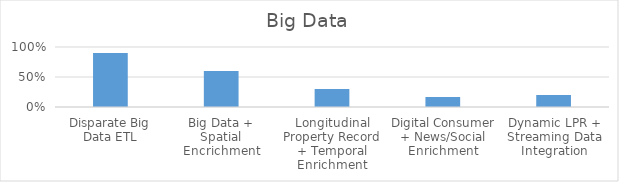
| Category | Series 0 |
|---|---|
| Disparate Big Data ETL | 0.9 |
| Big Data + Spatial Encrichment | 0.6 |
| Longitudinal Property Record + Temporal Enrichment | 0.3 |
| Digital Consumer + News/Social Enrichment | 0.167 |
| Dynamic LPR + Streaming Data Integration | 0.2 |